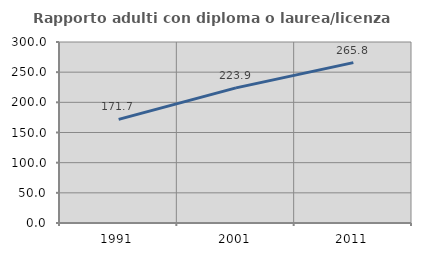
| Category | Rapporto adulti con diploma o laurea/licenza media  |
|---|---|
| 1991.0 | 171.735 |
| 2001.0 | 223.932 |
| 2011.0 | 265.843 |